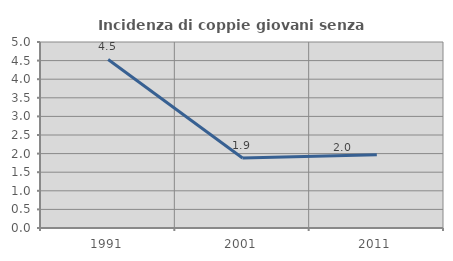
| Category | Incidenza di coppie giovani senza figli |
|---|---|
| 1991.0 | 4.531 |
| 2001.0 | 1.88 |
| 2011.0 | 1.97 |